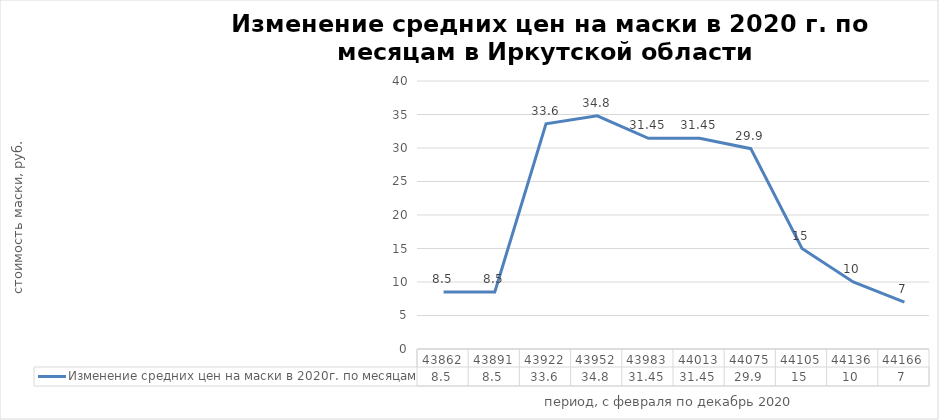
| Category | Изменение средних цен на маски в 2020г. по месяцам |
|---|---|
| 2020-02-01 | 8.5 |
| 2020-03-01 | 8.5 |
| 2020-04-01 | 33.6 |
| 2020-05-01 | 34.8 |
| 2020-06-01 | 31.45 |
| 2020-07-01 | 31.45 |
| 2020-09-01 | 29.9 |
| 2020-10-01 | 15 |
| 2020-11-01 | 10 |
| 2020-12-01 | 7 |